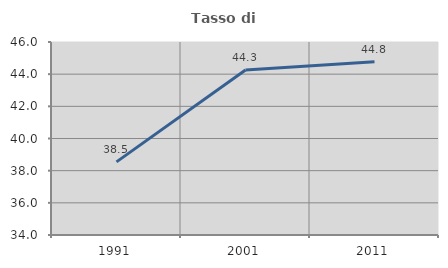
| Category | Tasso di occupazione   |
|---|---|
| 1991.0 | 38.548 |
| 2001.0 | 44.256 |
| 2011.0 | 44.778 |